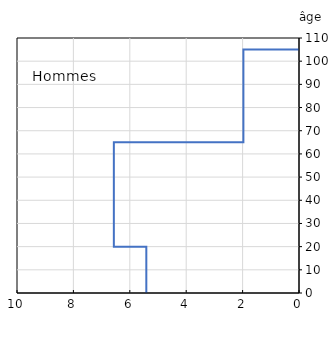
| Category | Hommes |
|---|---|
| -5.4144385026737964 | 0 |
| -5.4144385026737964 | 20 |
| -6.565656565656566 | 20 |
| -6.565656565656566 | 65 |
| -1.9719251336898396 | 65 |
| -1.9719251336898396 | 105 |
| 0.0 | 105 |